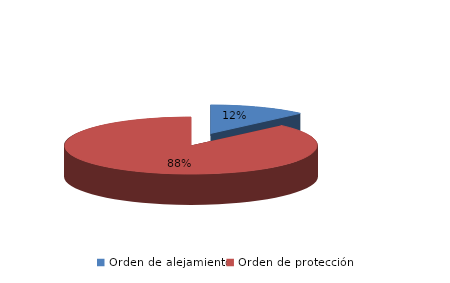
| Category | Series 0 |
|---|---|
| Orden de alejamiento | 702 |
| Orden de protección | 4916 |